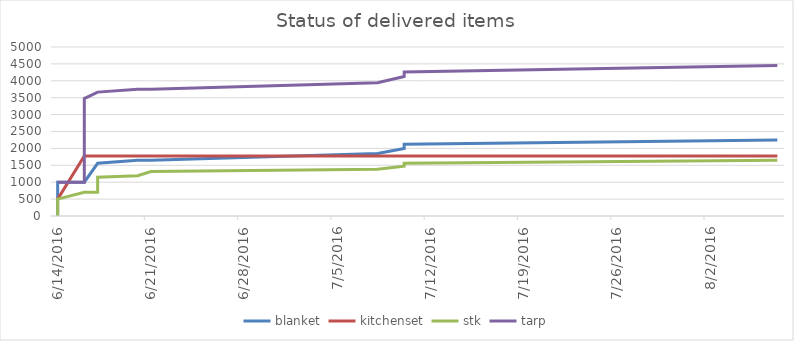
| Category | blanket | kitchenset | stk | tarp |
|---|---|---|---|---|
| 6/14/16 | 0 | 500 | 0 | 1000 |
| 6/14/16 | 1000 | 500 | 500 | 1000 |
| 6/16/16 | 1000 | 1777 | 700 | 1000 |
| 6/16/16 | 1000 | 1777 | 700 | 3475 |
| 6/17/16 | 1560 | 1777 | 700 | 3665 |
| 6/17/16 | 1560 | 1777 | 1147 | 3665 |
| 6/20/16 | 1646 | 1777 | 1190 | 3751 |
| 6/21/16 | 1646 | 1777 | 1315 | 3751 |
| 7/8/16 | 1850 | 1777 | 1381 | 3940 |
| 7/10/16 | 2000 | 1777 | 1471 | 4125 |
| 7/10/16 | 2125 | 1777 | 1559 | 4260 |
| 8/7/16 | 2250 | 1777 | 1651 | 4450 |